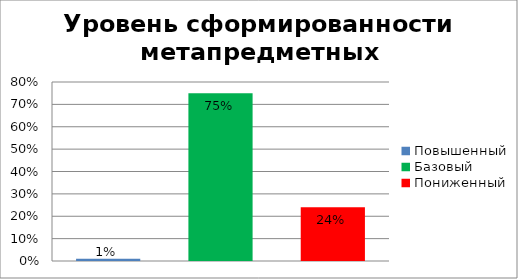
| Category | Уровень сформированности метапредметных результатов |
|---|---|
| Повышенный | 0.01 |
| Базовый | 0.75 |
| Пониженный | 0.24 |